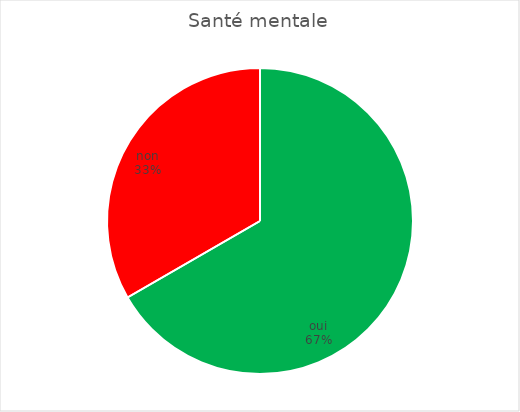
| Category | Santé mentale |
|---|---|
| oui | 6 |
| non | 3 |